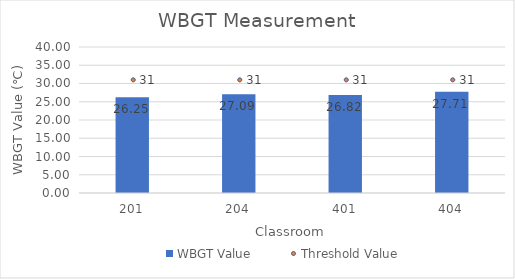
| Category | WBGT Value |
|---|---|
| 201.0 | 26.245 |
| 204.0 | 27.085 |
| 401.0 | 26.818 |
| 404.0 | 27.709 |